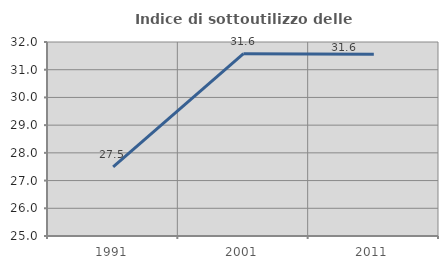
| Category | Indice di sottoutilizzo delle abitazioni  |
|---|---|
| 1991.0 | 27.491 |
| 2001.0 | 31.579 |
| 2011.0 | 31.56 |